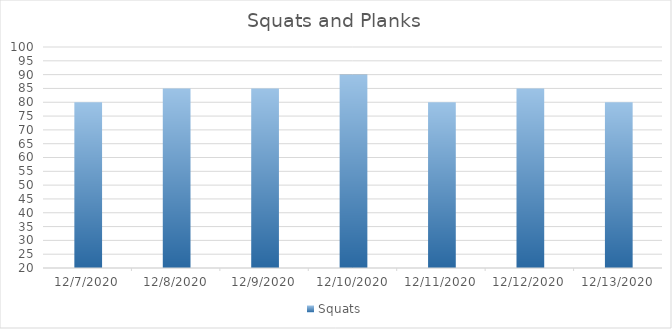
| Category | Squats |
|---|---|
| 12/7/20 | 80 |
| 12/8/20 | 85 |
| 12/9/20 | 85 |
| 12/10/20 | 90 |
| 12/11/20 | 80 |
| 12/12/20 | 85 |
| 12/13/20 | 80 |